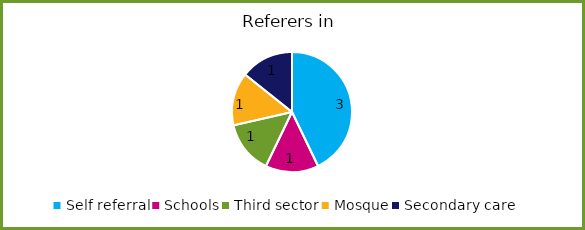
| Category | Series 0 |
|---|---|
| Self referral | 3 |
| Schools | 1 |
| Third sector | 1 |
| Mosque | 1 |
| Secondary care | 1 |